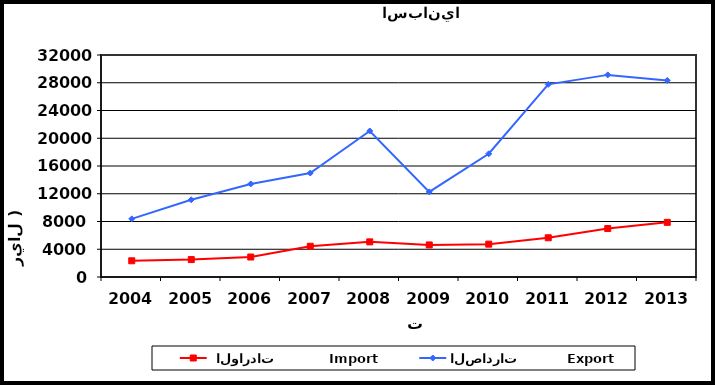
| Category |  الواردات           Import | الصادرات          Export |
|---|---|---|
| 2004.0 | 2336 | 8382 |
| 2005.0 | 2510 | 11134 |
| 2006.0 | 2880 | 13417 |
| 2007.0 | 4429 | 14990 |
| 2008.0 | 5064 | 21049 |
| 2009.0 | 4623 | 12274 |
| 2010.0 | 4735 | 17763 |
| 2011.0 | 5655 | 27770 |
| 2012.0 | 6984 | 29134 |
| 2013.0 | 7877 | 28334 |